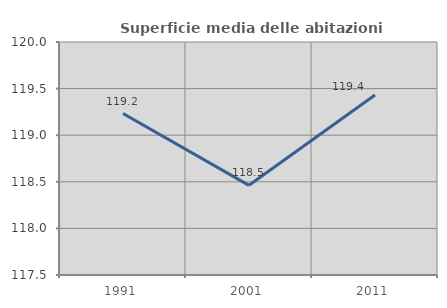
| Category | Superficie media delle abitazioni occupate |
|---|---|
| 1991.0 | 119.233 |
| 2001.0 | 118.462 |
| 2011.0 | 119.431 |